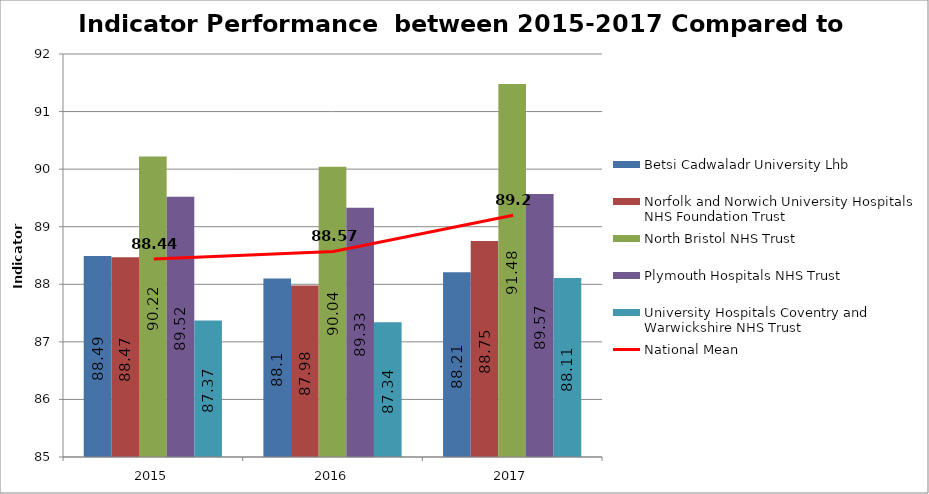
| Category | Betsi Cadwaladr University Lhb | Norfolk and Norwich University Hospitals NHS Foundation Trust | North Bristol NHS Trust | Plymouth Hospitals NHS Trust | University Hospitals Coventry and Warwickshire NHS Trust |
|---|---|---|---|---|---|
| 2015 | 88.49 | 88.47 | 90.22 | 89.52 | 87.37 |
| 2016 | 88.1 | 87.98 | 90.04 | 89.33 | 87.34 |
| 2017 | 88.21 | 88.75 | 91.48 | 89.57 | 88.11 |